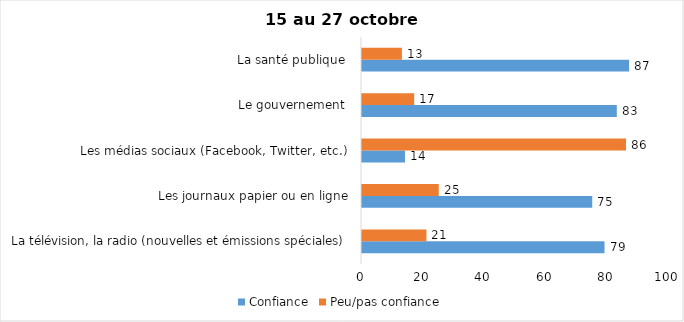
| Category | Confiance | Peu/pas confiance |
|---|---|---|
| La télévision, la radio (nouvelles et émissions spéciales) | 79 | 21 |
| Les journaux papier ou en ligne | 75 | 25 |
| Les médias sociaux (Facebook, Twitter, etc.) | 14 | 86 |
| Le gouvernement  | 83 | 17 |
| La santé publique  | 87 | 13 |